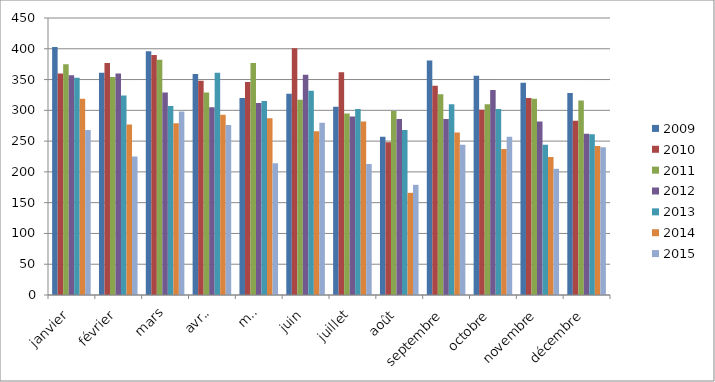
| Category | 2009 | 2010 | 2011 | 2012 | 2013 | 2014 | 2015 |
|---|---|---|---|---|---|---|---|
| janvier | 403 | 360 | 375 | 357 | 353 | 319 | 268 |
| février | 361 | 377 | 354 | 360 | 324 | 277 | 225 |
| mars | 396 | 390 | 382 | 329 | 307 | 279 | 298 |
| avril | 359 | 348 | 329 | 305 | 361 | 293 | 276 |
| mai | 320 | 346 | 377 | 312 | 315 | 287 | 214 |
| juin | 327 | 401 | 317 | 358 | 332 | 266 | 280 |
| juillet | 306 | 362 | 295 | 290 | 302 | 282 | 213 |
| août | 257 | 248 | 299 | 286 | 268 | 166 | 179 |
| septembre | 381 | 340 | 326 | 286 | 310 | 264 | 244 |
| octobre | 356 | 301 | 310 | 333 | 302 | 237 | 257 |
| novembre | 345 | 320 | 319 | 282 | 244 | 224 | 205 |
| décembre | 328 | 283 | 316 | 262 | 261 | 242 | 240 |